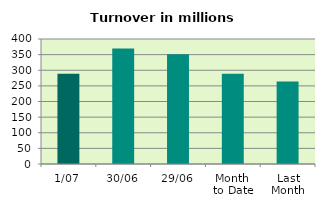
| Category | Series 0 |
|---|---|
| 1/07 | 288.689 |
| 30/06 | 369.65 |
| 29/06 | 350.866 |
| Month 
to Date | 288.689 |
| Last
Month | 264.074 |